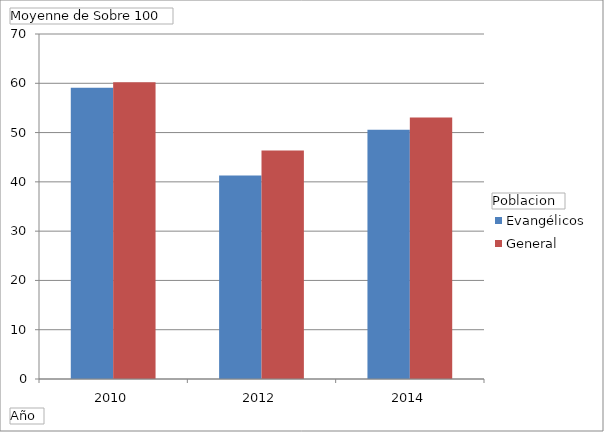
| Category | Evangélicos | General |
|---|---|---|
| 2010 | 59.088 | 60.186 |
| 2012 | 41.307 | 46.376 |
| 2014 | 50.595 | 53.033 |